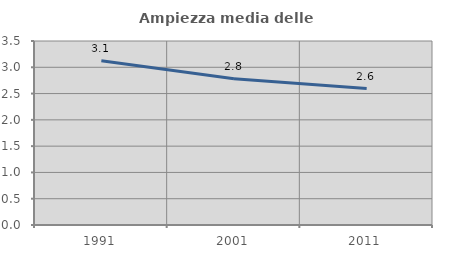
| Category | Ampiezza media delle famiglie |
|---|---|
| 1991.0 | 3.124 |
| 2001.0 | 2.781 |
| 2011.0 | 2.595 |